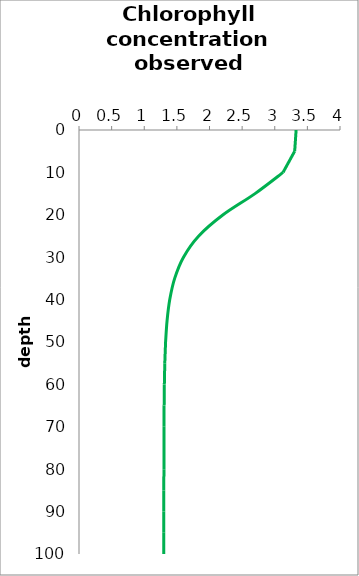
| Category | Profile 2 |
|---|---|
| 3.3274239599590967 | 0 |
| 3.3055919488386216 | 5 |
| 3.127200980901779 | 10 |
| 2.6980720377365164 | 15 |
| 2.20821519649013 | 20 |
| 1.8354992989493213 | 25 |
| 1.6014564418778119 | 30 |
| 1.466242046486406 | 35 |
| 1.3908582535955092 | 40 |
| 1.3494888158189604 | 45 |
| 1.3269528752615414 | 50 |
| 1.3147209554290171 | 55 |
| 1.3080940907372725 | 60 |
| 1.3045073484378285 | 65 |
| 1.3025670498477702 | 70 |
| 1.3015177073731996 | 75 |
| 1.3009502913777111 | 80 |
| 1.3006434943099552 | 85 |
| 1.3004776188617981 | 90 |
| 1.3003879373544294 | 95 |
| 1.3003394511460624 | 100 |